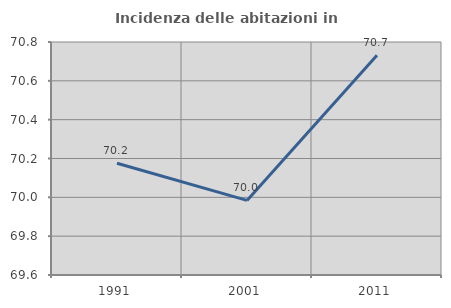
| Category | Incidenza delle abitazioni in proprietà  |
|---|---|
| 1991.0 | 70.176 |
| 2001.0 | 69.984 |
| 2011.0 | 70.731 |